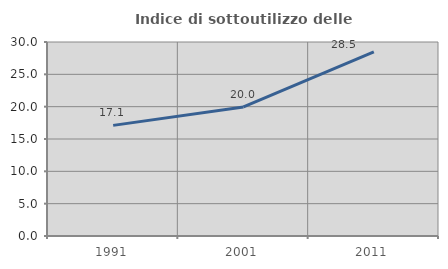
| Category | Indice di sottoutilizzo delle abitazioni  |
|---|---|
| 1991.0 | 17.108 |
| 2001.0 | 19.957 |
| 2011.0 | 28.469 |